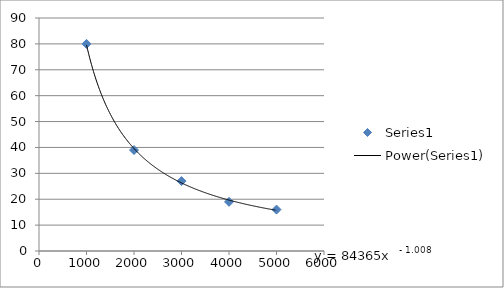
| Category | Series 0 |
|---|---|
| 1000.0 | 80 |
| 2000.0 | 39 |
| 3000.0 | 27 |
| 4000.0 | 19 |
| 5000.0 | 16 |